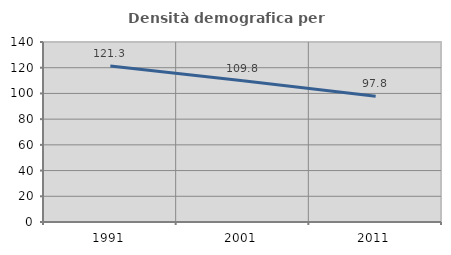
| Category | Densità demografica |
|---|---|
| 1991.0 | 121.259 |
| 2001.0 | 109.825 |
| 2011.0 | 97.792 |